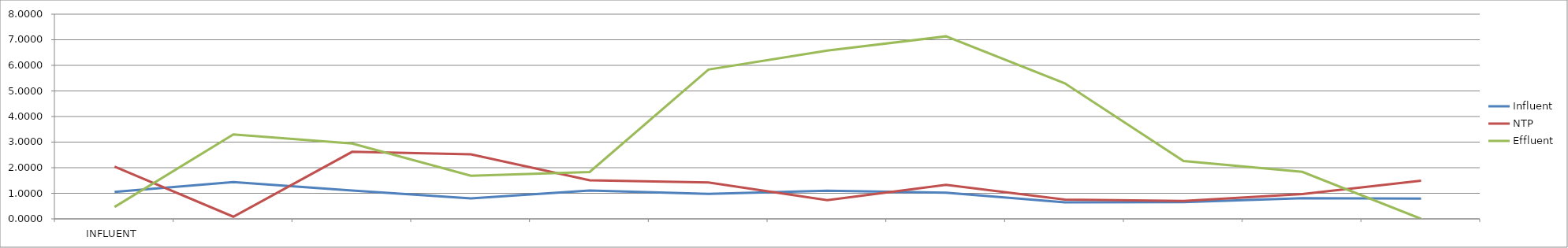
| Category | Influent | NTP | Effluent |
|---|---|---|---|
| 0 | 1.056 | 2.039 | 0.465 |
| 1 | 1.435 | 0.085 | 3.301 |
| 2 | 1.11 | 2.621 | 2.948 |
| 3 | 0.8 | 2.525 | 1.684 |
| 4 | 1.106 | 1.508 | 1.833 |
| 5 | 0.977 | 1.426 | 5.835 |
| 6 | 1.098 | 0.728 | 6.576 |
| 7 | 1.02 | 1.327 | 7.134 |
| 8 | 0.644 | 0.75 | 5.297 |
| 9 | 0.652 | 0.697 | 2.26 |
| 10 | 0.807 | 0.972 | 1.838 |
| 11 | 0.788 | 1.496 | 0 |